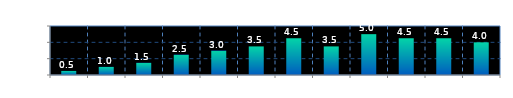
| Category | Series 0 |
|---|---|
| 0 | 0.5 |
| 1 | 1 |
| 2 | 1.5 |
| 3 | 2.5 |
| 4 | 3 |
| 5 | 3.5 |
| 6 | 4.5 |
| 7 | 3.5 |
| 8 | 5 |
| 9 | 4.5 |
| 10 | 4.5 |
| 11 | 4 |